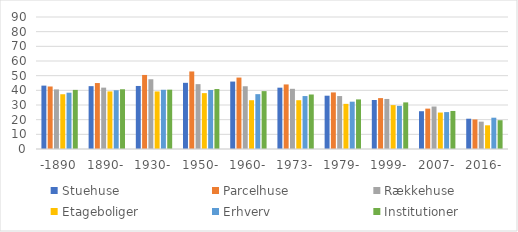
| Category | Stuehuse | Parcelhuse | Rækkehuse | Etageboliger | Erhverv | Institutioner |
|---|---|---|---|---|---|---|
| -1890 | 43.214 | 42.62 | 40.626 | 37.333 | 38.391 | 40.296 |
| 1890- | 42.85 | 44.969 | 41.839 | 39.26 | 40.075 | 40.722 |
| 1930- | 42.977 | 50.484 | 47.548 | 39.244 | 40.363 | 40.444 |
| 1950- | 45.123 | 52.87 | 44.221 | 38.089 | 40.229 | 40.887 |
| 1960- | 45.977 | 48.705 | 42.779 | 33.259 | 37.4 | 39.459 |
| 1973- | 41.812 | 44.019 | 41.041 | 33.259 | 36.101 | 37.163 |
| 1979- | 36.341 | 38.578 | 36.099 | 30.78 | 32.266 | 33.812 |
| 1999- | 33.424 | 34.702 | 34.121 | 29.915 | 29.411 | 31.777 |
| 2007- | 25.761 | 27.528 | 28.964 | 24.854 | 25.164 | 25.931 |
| 2016- | 20.642 | 20.134 | 18.66 | 16.153 | 21.338 | 19.622 |